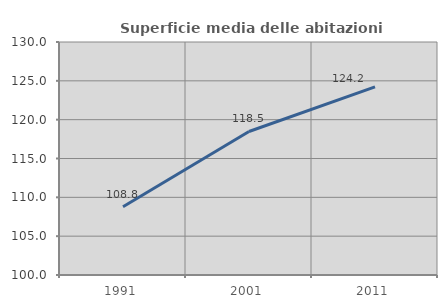
| Category | Superficie media delle abitazioni occupate |
|---|---|
| 1991.0 | 108.796 |
| 2001.0 | 118.479 |
| 2011.0 | 124.223 |